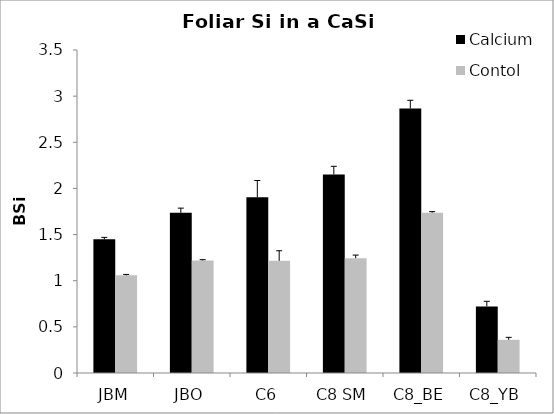
| Category | Calcium | Contol |
|---|---|---|
| JBM | 1.448 | 1.058 |
| JBO | 1.736 | 1.22 |
| C6 | 1.904 | 1.215 |
| C8 SM | 2.15 | 1.244 |
| C8_BE | 2.866 | 1.737 |
| C8_YB | 0.721 | 0.36 |